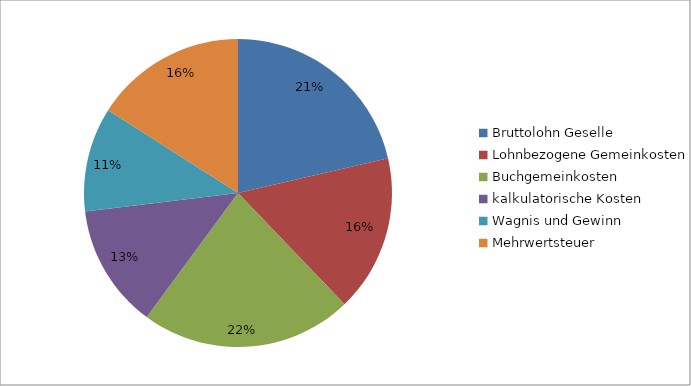
| Category | Series 0 |
|---|---|
| Bruttolohn Geselle | 0.214 |
| Lohnbezogene Gemeinkosten | 0.165 |
| Buchgemeinkosten | 0.223 |
| kalkulatorische Kosten | 0.13 |
| Wagnis und Gewinn | 0.11 |
| Mehrwertsteuer | 0.16 |